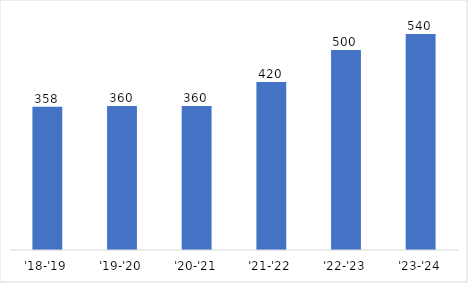
| Category | Enrollment |
|---|---|
| '18-'19 | 358 |
| '19-'20 | 360 |
| '20-'21 | 360 |
| '21-'22 | 420 |
| '22-'23 | 500 |
| '23-'24 | 540 |